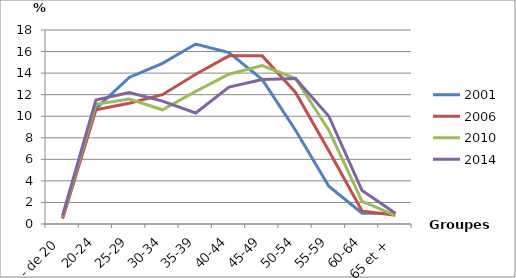
| Category | 2001 | 2006 | 2010 | 2014 |
|---|---|---|---|---|
| - de 20 | 0.6 | 0.5 | 0.7 | 0.8 |
| 20-24 | 10.7 | 10.6 | 11.1 | 11.5 |
| 25-29 | 13.6 | 11.2 | 11.6 | 12.2 |
| 30-34 | 14.9 | 12 | 10.6 | 11.4 |
| 35-39 | 16.7 | 13.9 | 12.3 | 10.3 |
| 40-44 | 15.9 | 15.6 | 13.9 | 12.7 |
| 45-49 | 13.4 | 15.6 | 14.7 | 13.4 |
| 50-54 | 8.7 | 12.2 | 13.5 | 13.5 |
| 55-59 | 3.5 | 6.8 | 8.7 | 10 |
| 60-64 | 1 | 1.2 | 2.1 | 3.1 |
| 65 et + | 1 | 0.8 | 0.8 | 1 |